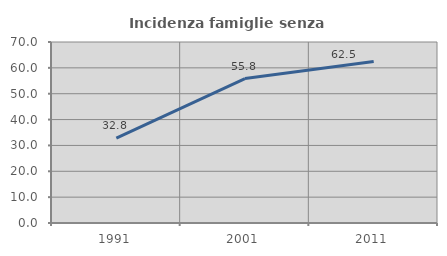
| Category | Incidenza famiglie senza nuclei |
|---|---|
| 1991.0 | 32.787 |
| 2001.0 | 55.844 |
| 2011.0 | 62.5 |